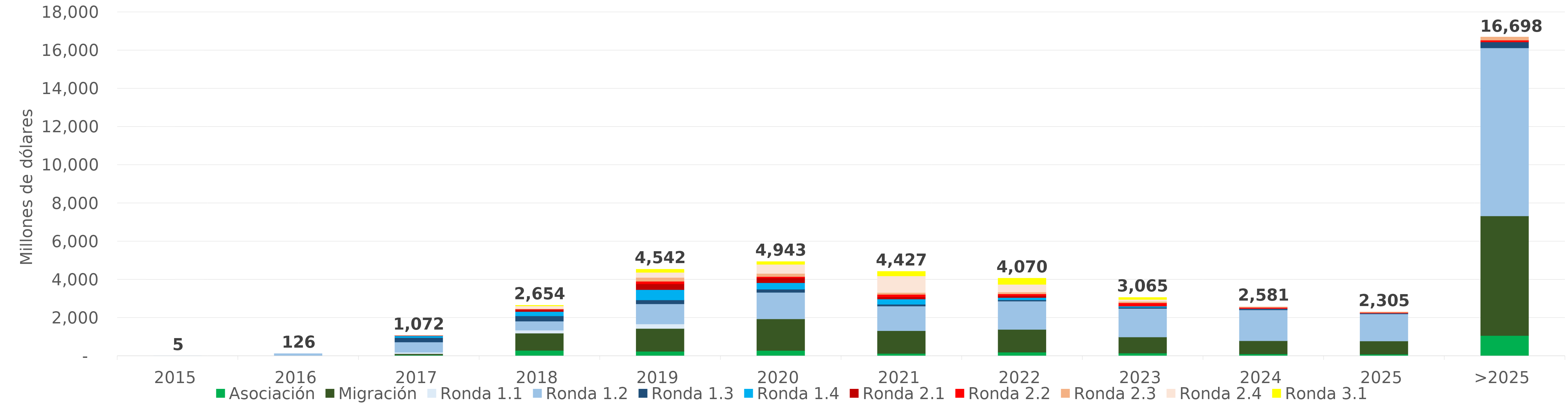
| Category | Asociación | Migración | Ronda 1.1 | Ronda 1.2 | Ronda 1.3 | Ronda 1.4 | Ronda 2.1 | Ronda 2.2 | Ronda 2.3 | Ronda 2.4 | Ronda 3.1 |
|---|---|---|---|---|---|---|---|---|---|---|---|
| 2015 | 0 | 0 | 4.573 | 0.236 | 0 | 0 | 0 | 0 | 0 | 0 | 0 |
| 2016 | 0 | 0 | 16.79 | 108.909 | 0 | 0 | 0 | 0 | 0 | 0 | 0 |
| 2017 | 50.877 | 65.422 | 76.429 | 533.486 | 231.789 | 93.443 | 18.851 | 1.29 | 0.72 | 0 | 0 |
| 2018 | 289.394 | 902.921 | 155.042 | 470.128 | 278.302 | 226.903 | 104.896 | 21.902 | 26.974 | 139.641 | 37.691 |
| 2019 | 241.207 | 1195.818 | 236.68 | 1049.68 | 207.126 | 540.649 | 302.09 | 133.009 | 199.161 | 270.262 | 166.186 |
| 2020 | 284.321 | 1655.641 | 6.736 | 1382.287 | 161.213 | 341.057 | 252.645 | 70.216 | 163.112 | 477.469 | 148.013 |
| 2021 | 127.797 | 1192.243 | 2.229 | 1284.713 | 97.796 | 274.593 | 106.762 | 133.184 | 98.223 | 870.647 | 238.989 |
| 2022 | 194.279 | 1192.976 | 0 | 1478.874 | 70.216 | 119.859 | 103.447 | 87.487 | 99.65 | 397.454 | 325.496 |
| 2023 | 149.166 | 842.772 | 0 | 1490.693 | 65.659 | 59.302 | 0.019 | 172.473 | 72.864 | 104.985 | 107.018 |
| 2024 | 102.681 | 691.937 | 0 | 1611.631 | 57.216 | 10.68 | 0 | 65.107 | 40.313 | 1.529 | 0 |
| 2025 | 89.748 | 692.667 | 0 | 1414.16 | 37.877 | 5.238 | 0 | 35.777 | 29.237 | 0 | 0 |
| >2025 | 1066.13 | 6262.668 | 0 | 8795.067 | 310.453 | 0 | 0 | 95.608 | 167.814 | 0 | 0 |